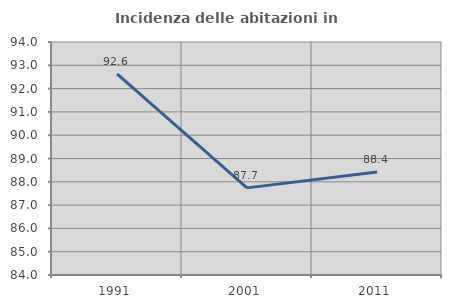
| Category | Incidenza delle abitazioni in proprietà  |
|---|---|
| 1991.0 | 92.636 |
| 2001.0 | 87.739 |
| 2011.0 | 88.417 |